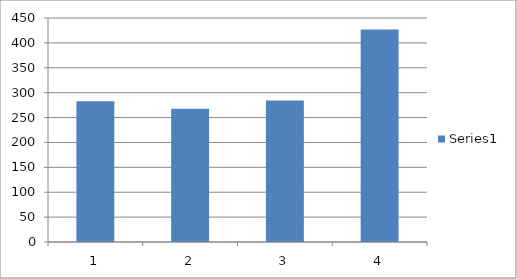
| Category | Series 0 |
|---|---|
| 0 | 282.557 |
| 1 | 267.666 |
| 2 | 284.137 |
| 3 | 426.849 |